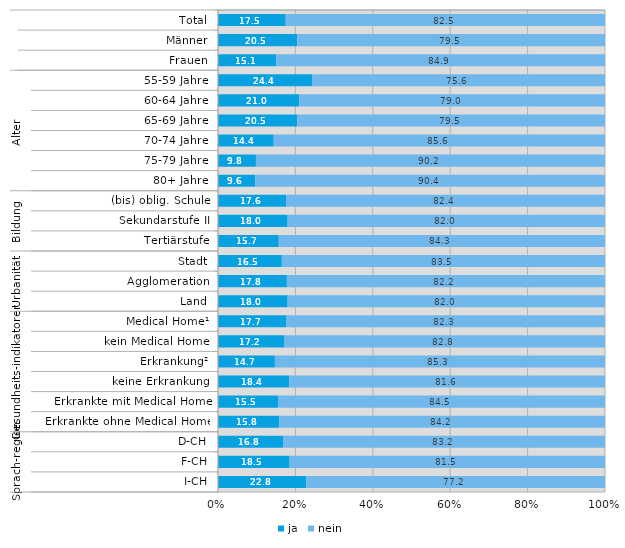
| Category | ja | nein |
|---|---|---|
| 0 | 17.5 | 82.5 |
| 1 | 20.5 | 79.5 |
| 2 | 15.1 | 84.9 |
| 3 | 24.4 | 75.6 |
| 4 | 21 | 79 |
| 5 | 20.5 | 79.5 |
| 6 | 14.4 | 85.6 |
| 7 | 9.8 | 90.2 |
| 8 | 9.6 | 90.4 |
| 9 | 17.6 | 82.4 |
| 10 | 18 | 82 |
| 11 | 15.7 | 84.3 |
| 12 | 16.5 | 83.5 |
| 13 | 17.8 | 82.2 |
| 14 | 18 | 82 |
| 15 | 17.7 | 82.3 |
| 16 | 17.2 | 82.8 |
| 17 | 14.7 | 85.3 |
| 18 | 18.4 | 81.6 |
| 19 | 15.5 | 84.5 |
| 20 | 15.8 | 84.2 |
| 21 | 16.8 | 83.2 |
| 22 | 18.5 | 81.5 |
| 23 | 22.8 | 77.2 |